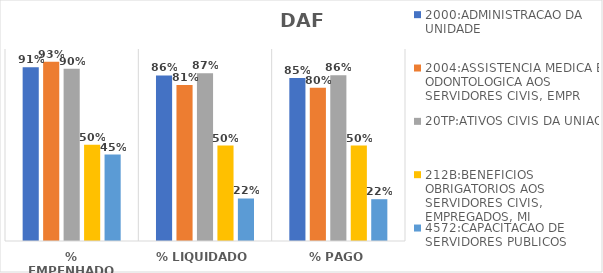
| Category | 2000:ADMINISTRACAO DA UNIDADE | 2004:ASSISTENCIA MEDICA E ODONTOLOGICA AOS SERVIDORES CIVIS, EMPR | 20TP:ATIVOS CIVIS DA UNIAO | 212B:BENEFICIOS OBRIGATORIOS AOS SERVIDORES CIVIS, EMPREGADOS, MI | 4572:CAPACITACAO DE SERVIDORES PUBLICOS FEDERAIS EM PROCESSO DE Q |
|---|---|---|---|---|---|
| % EMPENHADO | 0.906 | 0.934 | 0.898 | 0.502 | 0.45 |
| % LIQUIDADO | 0.862 | 0.813 | 0.873 | 0.497 | 0.221 |
| % PAGO | 0.849 | 0.799 | 0.863 | 0.497 | 0.218 |